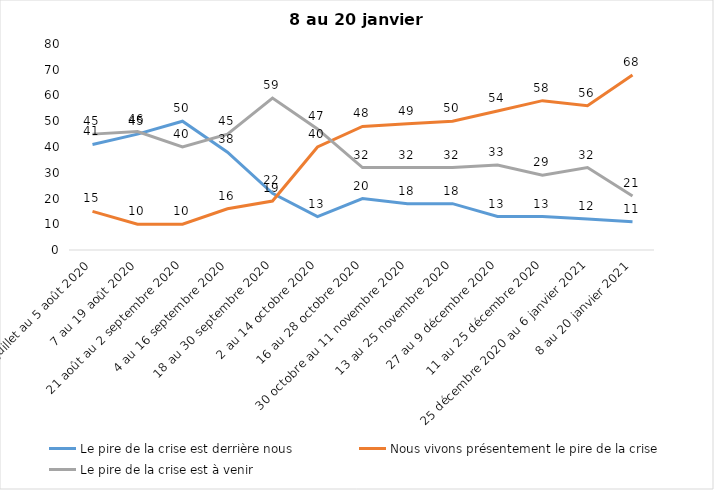
| Category | Le pire de la crise est derrière nous | Nous vivons présentement le pire de la crise | Le pire de la crise est à venir |
|---|---|---|---|
| 24 juillet au 5 août 2020 | 41 | 15 | 45 |
| 7 au 19 août 2020 | 45 | 10 | 46 |
| 21 août au 2 septembre 2020 | 50 | 10 | 40 |
| 4 au 16 septembre 2020 | 38 | 16 | 45 |
| 18 au 30 septembre 2020 | 22 | 19 | 59 |
| 2 au 14 octobre 2020 | 13 | 40 | 47 |
| 16 au 28 octobre 2020 | 20 | 48 | 32 |
| 30 octobre au 11 novembre 2020 | 18 | 49 | 32 |
| 13 au 25 novembre 2020 | 18 | 50 | 32 |
| 27 au 9 décembre 2020 | 13 | 54 | 33 |
| 11 au 25 décembre 2020 | 13 | 58 | 29 |
| 25 décembre 2020 au 6 janvier 2021 | 12 | 56 | 32 |
| 8 au 20 janvier 2021 | 11 | 68 | 21 |